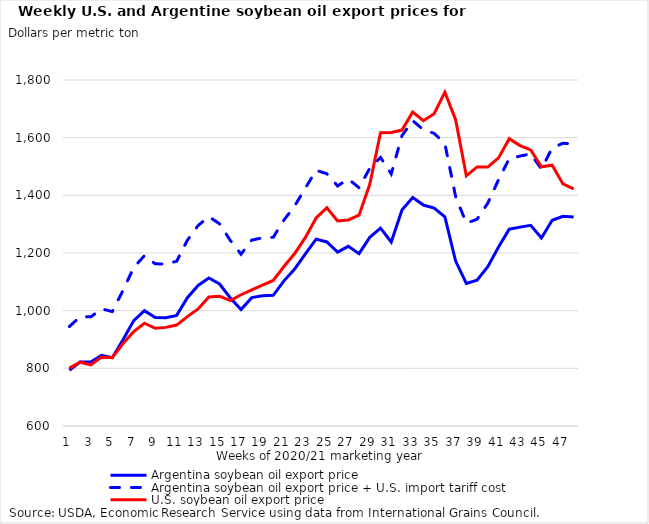
| Category | Argentina soybean oil export price | Argentina soybean oil export price + U.S. import tariff cost | U.S. soybean oil export price |
|---|---|---|---|
| 1.0 | 793.4 | 944.939 | 800.788 |
| 2.0 | 822 | 979.002 | 821.352 |
| 3.0 | 821.6 | 978.526 | 812.306 |
| 4.0 | 845 | 1006.395 | 838.904 |
| 5.0 | 837 | 996.867 | 836.63 |
| 6.0 | 898.8 | 1070.471 | 885.79 |
| 7.0 | 965.4 | 1149.791 | 927.108 |
| 8.0 | 1000 | 1191 | 956.318 |
| 9.0 | 976 | 1162.416 | 938.83 |
| 10.0 | 975.6 | 1161.94 | 942.066 |
| 11.0 | 983.6 | 1171.468 | 950 |
| 12.0 | 1044.8 | 1244.357 | 979.474 |
| 13.0 | 1087.6 | 1295.332 | 1006.05 |
| 14.0 | 1113.4 | 1326.059 | 1047.202 |
| 15.0 | 1092.6 | 1301.287 | 1050.322 |
| 16.0 | 1044.2 | 1243.642 | 1034.754 |
| 17.0 | 1004 | 1195.764 | 1055.2 |
| 18.0 | 1045.2 | 1244.833 | 1071.858 |
| 19.0 | 1051.8 | 1252.694 | 1088.482 |
| 20.0 | 1053.2 | 1254.361 | 1104.846 |
| 21.0 | 1103.4 | 1314.149 | 1153.092 |
| 22.0 | 1144.6 | 1363.219 | 1198.322 |
| 23.0 | 1196.8 | 1425.389 | 1253.902 |
| 24.0 | 1248.2 | 1486.606 | 1321.584 |
| 25.0 | 1238.4 | 1474.934 | 1356.748 |
| 26.0 | 1202.8 | 1432.535 | 1311.356 |
| 27.0 | 1223 | 1456.593 | 1314.708 |
| 28.0 | 1197.6 | 1426.342 | 1331.206 |
| 29.0 | 1254.2 | 1493.752 | 1438.428 |
| 30.0 | 1286 | 1531.626 | 1617.34 |
| 31.0 | 1238 | 1474.458 | 1618.148 |
| 32.0 | 1349.2 | 1606.897 | 1626.384 |
| 33.0 | 1392.8 | 1658.825 | 1689.13 |
| 34.0 | 1366.4 | 1627.382 | 1658.884 |
| 35.0 | 1356 | 1614.996 | 1682.952 |
| 36.0 | 1325.6 | 1578.79 | 1757.96 |
| 37.0 | 1172 | 1395.852 | 1662.002 |
| 38.0 | 1094.4 | 1303.43 | 1467.736 |
| 39.0 | 1105.8 | 1317.008 | 1498.414 |
| 40.0 | 1152.8 | 1372.985 | 1498.174 |
| 41.0 | 1220.8 | 1453.973 | 1529.8 |
| 42.0 | 1282.6 | 1527.577 | 1596.584 |
| 43.0 | 1289.8 | 1536.152 | 1572.494 |
| 44.0 | 1296.2 | 1543.774 | 1557.428 |
| 45.0 | 1252.2 | 1491.37 | 1498.802 |
| 46.0 | 1313.4 | 1564.259 | 1504.332 |
| 47.0 | 1327.2 | 1580.695 | 1439.492 |
| 48.0 | 1325 | 1578.075 | 1422.476 |